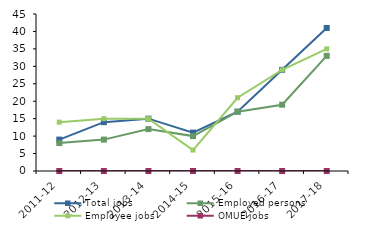
| Category | Total jobs | Employed persons | Employee jobs | OMUE jobs |
|---|---|---|---|---|
| 2011-12 | 9 | 8 | 14 | 0 |
| 2012-13 | 14 | 9 | 15 | 0 |
| 2013-14 | 15 | 12 | 15 | 0 |
| 2014-15 | 11 | 10 | 6 | 0 |
| 2015-16 | 17 | 17 | 21 | 0 |
| 2016-17 | 29 | 19 | 29 | 0 |
| 2017-18 | 41 | 33 | 35 | 0 |